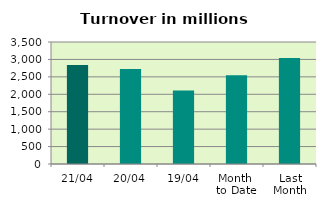
| Category | Series 0 |
|---|---|
| 21/04 | 2841.893 |
| 20/04 | 2725.827 |
| 19/04 | 2105.185 |
| Month 
to Date | 2546.65 |
| Last
Month | 3040.277 |